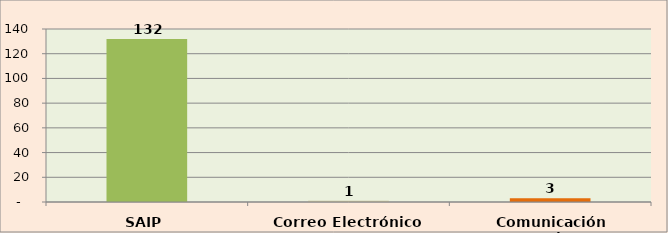
| Category | Cantidad |
|---|---|
| SAIP | 132 |
| Correo Electrónico | 1 |
| Comunicación Escrita | 3 |